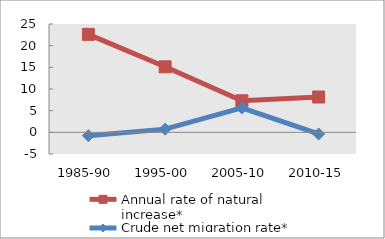
| Category | Annual rate of natural increase* | Crude net migration rate* |
|---|---|---|
| 1985-90 | 22.608 | -0.765 |
| 1995-00 | 15.118 | 0.737 |
| 2005-10 | 7.28 | 5.628 |
| 2010-15 | 8.153 | -0.381 |